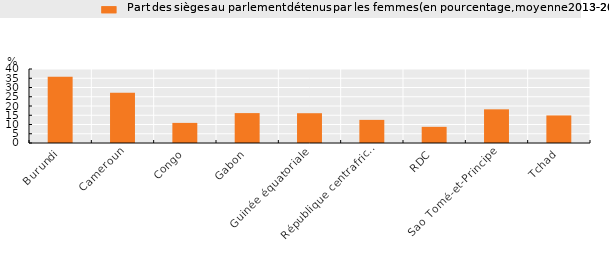
| Category | Part des sièges au parlement détenus par les femmes (en pourcentage, moyenne 2013-2015) |
|---|---|
|  Burundi | 35.867 |
|  Cameroun | 27.1 |
|  Congo | 10.867 |
| Gabon | 16.167 |
| Guinée équatoriale | 16.1 |
| République centrafricaine | 12.5 |
| RDC | 8.733 |
|  Sao Tomé-et-Principe | 18.2 |
|  Tchad | 14.9 |